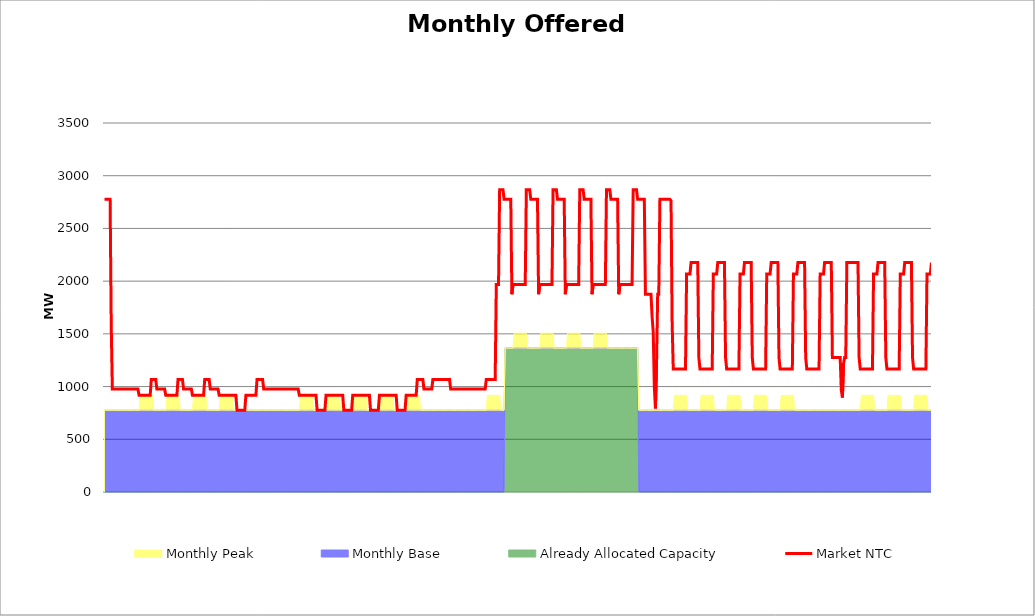
| Category | Market NTC |
|---|---|
| 0 | 2776 |
| 1 | 2776 |
| 2 | 2776 |
| 3 | 2776 |
| 4 | 2776 |
| 5 | 2776 |
| 6 | 1576 |
| 7 | 976 |
| 8 | 976 |
| 9 | 976 |
| 10 | 976 |
| 11 | 976 |
| 12 | 976 |
| 13 | 976 |
| 14 | 976 |
| 15 | 976 |
| 16 | 976 |
| 17 | 976 |
| 18 | 976 |
| 19 | 976 |
| 20 | 976 |
| 21 | 976 |
| 22 | 976 |
| 23 | 976 |
| 24 | 976 |
| 25 | 976 |
| 26 | 976 |
| 27 | 976 |
| 28 | 976 |
| 29 | 976 |
| 30 | 976 |
| 31 | 917 |
| 32 | 917 |
| 33 | 917 |
| 34 | 917 |
| 35 | 917 |
| 36 | 917 |
| 37 | 917 |
| 38 | 917 |
| 39 | 917 |
| 40 | 917 |
| 41 | 917 |
| 42 | 1067 |
| 43 | 1067 |
| 44 | 1067 |
| 45 | 1067 |
| 46 | 1067 |
| 47 | 976 |
| 48 | 976 |
| 49 | 976 |
| 50 | 976 |
| 51 | 976 |
| 52 | 976 |
| 53 | 976 |
| 54 | 976 |
| 55 | 917 |
| 56 | 917 |
| 57 | 917 |
| 58 | 917 |
| 59 | 917 |
| 60 | 917 |
| 61 | 917 |
| 62 | 917 |
| 63 | 917 |
| 64 | 917 |
| 65 | 917 |
| 66 | 1067 |
| 67 | 1067 |
| 68 | 1067 |
| 69 | 1067 |
| 70 | 1067 |
| 71 | 976 |
| 72 | 976 |
| 73 | 976 |
| 74 | 976 |
| 75 | 976 |
| 76 | 976 |
| 77 | 976 |
| 78 | 976 |
| 79 | 917 |
| 80 | 917 |
| 81 | 917 |
| 82 | 917 |
| 83 | 917 |
| 84 | 917 |
| 85 | 917 |
| 86 | 917 |
| 87 | 917 |
| 88 | 917 |
| 89 | 917 |
| 90 | 1067 |
| 91 | 1067 |
| 92 | 1067 |
| 93 | 1067 |
| 94 | 1067 |
| 95 | 976 |
| 96 | 976 |
| 97 | 976 |
| 98 | 976 |
| 99 | 976 |
| 100 | 976 |
| 101 | 976 |
| 102 | 976 |
| 103 | 917 |
| 104 | 917 |
| 105 | 917 |
| 106 | 917 |
| 107 | 917 |
| 108 | 917 |
| 109 | 917 |
| 110 | 917 |
| 111 | 917 |
| 112 | 917 |
| 113 | 917 |
| 114 | 917 |
| 115 | 917 |
| 116 | 917 |
| 117 | 917 |
| 118 | 917 |
| 119 | 776 |
| 120 | 776 |
| 121 | 776 |
| 122 | 776 |
| 123 | 776 |
| 124 | 776 |
| 125 | 776 |
| 126 | 776 |
| 127 | 917 |
| 128 | 917 |
| 129 | 917 |
| 130 | 917 |
| 131 | 917 |
| 132 | 917 |
| 133 | 917 |
| 134 | 917 |
| 135 | 917 |
| 136 | 917 |
| 137 | 1067 |
| 138 | 1067 |
| 139 | 1067 |
| 140 | 1067 |
| 141 | 1067 |
| 142 | 1067 |
| 143 | 976 |
| 144 | 976 |
| 145 | 976 |
| 146 | 976 |
| 147 | 976 |
| 148 | 976 |
| 149 | 976 |
| 150 | 976 |
| 151 | 976 |
| 152 | 976 |
| 153 | 976 |
| 154 | 976 |
| 155 | 976 |
| 156 | 976 |
| 157 | 976 |
| 158 | 976 |
| 159 | 976 |
| 160 | 976 |
| 161 | 976 |
| 162 | 976 |
| 163 | 976 |
| 164 | 976 |
| 165 | 976 |
| 166 | 976 |
| 167 | 976 |
| 168 | 976 |
| 169 | 976 |
| 170 | 976 |
| 171 | 976 |
| 172 | 976 |
| 173 | 976 |
| 174 | 976 |
| 175 | 917 |
| 176 | 917 |
| 177 | 917 |
| 178 | 917 |
| 179 | 917 |
| 180 | 917 |
| 181 | 917 |
| 182 | 917 |
| 183 | 917 |
| 184 | 917 |
| 185 | 917 |
| 186 | 917 |
| 187 | 917 |
| 188 | 917 |
| 189 | 917 |
| 190 | 917 |
| 191 | 776 |
| 192 | 776 |
| 193 | 776 |
| 194 | 776 |
| 195 | 776 |
| 196 | 776 |
| 197 | 776 |
| 198 | 776 |
| 199 | 917 |
| 200 | 917 |
| 201 | 917 |
| 202 | 917 |
| 203 | 917 |
| 204 | 917 |
| 205 | 917 |
| 206 | 917 |
| 207 | 917 |
| 208 | 917 |
| 209 | 917 |
| 210 | 917 |
| 211 | 917 |
| 212 | 917 |
| 213 | 917 |
| 214 | 917 |
| 215 | 776 |
| 216 | 776 |
| 217 | 776 |
| 218 | 776 |
| 219 | 776 |
| 220 | 776 |
| 221 | 776 |
| 222 | 776 |
| 223 | 917 |
| 224 | 917 |
| 225 | 917 |
| 226 | 917 |
| 227 | 917 |
| 228 | 917 |
| 229 | 917 |
| 230 | 917 |
| 231 | 917 |
| 232 | 917 |
| 233 | 917 |
| 234 | 917 |
| 235 | 917 |
| 236 | 917 |
| 237 | 917 |
| 238 | 917 |
| 239 | 776 |
| 240 | 776 |
| 241 | 776 |
| 242 | 776 |
| 243 | 776 |
| 244 | 776 |
| 245 | 776 |
| 246 | 776 |
| 247 | 917 |
| 248 | 917 |
| 249 | 917 |
| 250 | 917 |
| 251 | 917 |
| 252 | 917 |
| 253 | 917 |
| 254 | 917 |
| 255 | 917 |
| 256 | 917 |
| 257 | 917 |
| 258 | 917 |
| 259 | 917 |
| 260 | 917 |
| 261 | 917 |
| 262 | 917 |
| 263 | 776 |
| 264 | 776 |
| 265 | 776 |
| 266 | 776 |
| 267 | 776 |
| 268 | 776 |
| 269 | 776 |
| 270 | 776 |
| 271 | 917 |
| 272 | 917 |
| 273 | 917 |
| 274 | 917 |
| 275 | 917 |
| 276 | 917 |
| 277 | 917 |
| 278 | 917 |
| 279 | 917 |
| 280 | 917 |
| 281 | 1067 |
| 282 | 1067 |
| 283 | 1067 |
| 284 | 1067 |
| 285 | 1067 |
| 286 | 1067 |
| 287 | 976 |
| 288 | 976 |
| 289 | 976 |
| 290 | 976 |
| 291 | 976 |
| 292 | 976 |
| 293 | 976 |
| 294 | 976 |
| 295 | 1067 |
| 296 | 1067 |
| 297 | 1067 |
| 298 | 1067 |
| 299 | 1067 |
| 300 | 1067 |
| 301 | 1067 |
| 302 | 1067 |
| 303 | 1067 |
| 304 | 1067 |
| 305 | 1067 |
| 306 | 1067 |
| 307 | 1067 |
| 308 | 1067 |
| 309 | 1067 |
| 310 | 1067 |
| 311 | 976 |
| 312 | 976 |
| 313 | 976 |
| 314 | 976 |
| 315 | 976 |
| 316 | 976 |
| 317 | 976 |
| 318 | 976 |
| 319 | 976 |
| 320 | 976 |
| 321 | 976 |
| 322 | 976 |
| 323 | 976 |
| 324 | 976 |
| 325 | 976 |
| 326 | 976 |
| 327 | 976 |
| 328 | 976 |
| 329 | 976 |
| 330 | 976 |
| 331 | 976 |
| 332 | 976 |
| 333 | 976 |
| 334 | 976 |
| 335 | 976 |
| 336 | 976 |
| 337 | 976 |
| 338 | 976 |
| 339 | 976 |
| 340 | 976 |
| 341 | 976 |
| 342 | 976 |
| 343 | 1067 |
| 344 | 1067 |
| 345 | 1067 |
| 346 | 1067 |
| 347 | 1067 |
| 348 | 1067 |
| 349 | 1067 |
| 350 | 1067 |
| 351 | 1067 |
| 352 | 1967 |
| 353 | 1967 |
| 354 | 1967 |
| 355 | 2867 |
| 356 | 2867 |
| 357 | 2867 |
| 358 | 2867 |
| 359 | 2776 |
| 360 | 2776 |
| 361 | 2776 |
| 362 | 2776 |
| 363 | 2776 |
| 364 | 2776 |
| 365 | 2776 |
| 366 | 1876 |
| 367 | 1967 |
| 368 | 1967 |
| 369 | 1967 |
| 370 | 1967 |
| 371 | 1967 |
| 372 | 1967 |
| 373 | 1967 |
| 374 | 1967 |
| 375 | 1967 |
| 376 | 1967 |
| 377 | 1967 |
| 378 | 1967 |
| 379 | 2867 |
| 380 | 2867 |
| 381 | 2867 |
| 382 | 2867 |
| 383 | 2776 |
| 384 | 2776 |
| 385 | 2776 |
| 386 | 2776 |
| 387 | 2776 |
| 388 | 2776 |
| 389 | 2776 |
| 390 | 1876 |
| 391 | 1967 |
| 392 | 1967 |
| 393 | 1967 |
| 394 | 1967 |
| 395 | 1967 |
| 396 | 1967 |
| 397 | 1967 |
| 398 | 1967 |
| 399 | 1967 |
| 400 | 1967 |
| 401 | 1967 |
| 402 | 1967 |
| 403 | 2867 |
| 404 | 2867 |
| 405 | 2867 |
| 406 | 2867 |
| 407 | 2776 |
| 408 | 2776 |
| 409 | 2776 |
| 410 | 2776 |
| 411 | 2776 |
| 412 | 2776 |
| 413 | 2776 |
| 414 | 1876 |
| 415 | 1967 |
| 416 | 1967 |
| 417 | 1967 |
| 418 | 1967 |
| 419 | 1967 |
| 420 | 1967 |
| 421 | 1967 |
| 422 | 1967 |
| 423 | 1967 |
| 424 | 1967 |
| 425 | 1967 |
| 426 | 1967 |
| 427 | 2867 |
| 428 | 2867 |
| 429 | 2867 |
| 430 | 2867 |
| 431 | 2776 |
| 432 | 2776 |
| 433 | 2776 |
| 434 | 2776 |
| 435 | 2776 |
| 436 | 2776 |
| 437 | 2776 |
| 438 | 1876 |
| 439 | 1967 |
| 440 | 1967 |
| 441 | 1967 |
| 442 | 1967 |
| 443 | 1967 |
| 444 | 1967 |
| 445 | 1967 |
| 446 | 1967 |
| 447 | 1967 |
| 448 | 1967 |
| 449 | 1967 |
| 450 | 1967 |
| 451 | 2867 |
| 452 | 2867 |
| 453 | 2867 |
| 454 | 2867 |
| 455 | 2776 |
| 456 | 2776 |
| 457 | 2776 |
| 458 | 2776 |
| 459 | 2776 |
| 460 | 2776 |
| 461 | 2776 |
| 462 | 1876 |
| 463 | 1967 |
| 464 | 1967 |
| 465 | 1967 |
| 466 | 1967 |
| 467 | 1967 |
| 468 | 1967 |
| 469 | 1967 |
| 470 | 1967 |
| 471 | 1967 |
| 472 | 1967 |
| 473 | 1967 |
| 474 | 1967 |
| 475 | 2867 |
| 476 | 2867 |
| 477 | 2867 |
| 478 | 2867 |
| 479 | 2776 |
| 480 | 2776 |
| 481 | 2776 |
| 482 | 2776 |
| 483 | 2776 |
| 484 | 2776 |
| 485 | 2776 |
| 486 | 1876 |
| 487 | 1876 |
| 488 | 1876 |
| 489 | 1876 |
| 490 | 1876 |
| 491 | 1876 |
| 492 | 1662 |
| 493 | 1520 |
| 494 | 995 |
| 495 | 793 |
| 496 | 1217 |
| 497 | 1876 |
| 498 | 1876 |
| 499 | 2776 |
| 500 | 2776 |
| 501 | 2776 |
| 502 | 2776 |
| 503 | 2776 |
| 504 | 2776 |
| 505 | 2776 |
| 506 | 2776 |
| 507 | 2776 |
| 508 | 2776 |
| 509 | 2763 |
| 510 | 1608 |
| 511 | 1167 |
| 512 | 1167 |
| 513 | 1167 |
| 514 | 1167 |
| 515 | 1167 |
| 516 | 1167 |
| 517 | 1167 |
| 518 | 1167 |
| 519 | 1167 |
| 520 | 1167 |
| 521 | 1167 |
| 522 | 1167 |
| 523 | 2067 |
| 524 | 2067 |
| 525 | 2067 |
| 526 | 2067 |
| 527 | 2176 |
| 528 | 2176 |
| 529 | 2176 |
| 530 | 2176 |
| 531 | 2176 |
| 532 | 2176 |
| 533 | 2176 |
| 534 | 1276 |
| 535 | 1167 |
| 536 | 1167 |
| 537 | 1167 |
| 538 | 1167 |
| 539 | 1167 |
| 540 | 1167 |
| 541 | 1167 |
| 542 | 1167 |
| 543 | 1167 |
| 544 | 1167 |
| 545 | 1167 |
| 546 | 1167 |
| 547 | 2067 |
| 548 | 2067 |
| 549 | 2067 |
| 550 | 2067 |
| 551 | 2176 |
| 552 | 2176 |
| 553 | 2176 |
| 554 | 2176 |
| 555 | 2176 |
| 556 | 2176 |
| 557 | 2176 |
| 558 | 1276 |
| 559 | 1167 |
| 560 | 1167 |
| 561 | 1167 |
| 562 | 1167 |
| 563 | 1167 |
| 564 | 1167 |
| 565 | 1167 |
| 566 | 1167 |
| 567 | 1167 |
| 568 | 1167 |
| 569 | 1167 |
| 570 | 1167 |
| 571 | 2067 |
| 572 | 2067 |
| 573 | 2067 |
| 574 | 2067 |
| 575 | 2176 |
| 576 | 2176 |
| 577 | 2176 |
| 578 | 2176 |
| 579 | 2176 |
| 580 | 2176 |
| 581 | 2176 |
| 582 | 1276 |
| 583 | 1167 |
| 584 | 1167 |
| 585 | 1167 |
| 586 | 1167 |
| 587 | 1167 |
| 588 | 1167 |
| 589 | 1167 |
| 590 | 1167 |
| 591 | 1167 |
| 592 | 1167 |
| 593 | 1167 |
| 594 | 1167 |
| 595 | 2067 |
| 596 | 2067 |
| 597 | 2067 |
| 598 | 2067 |
| 599 | 2176 |
| 600 | 2176 |
| 601 | 2176 |
| 602 | 2176 |
| 603 | 2176 |
| 604 | 2176 |
| 605 | 2176 |
| 606 | 1276 |
| 607 | 1167 |
| 608 | 1167 |
| 609 | 1167 |
| 610 | 1167 |
| 611 | 1167 |
| 612 | 1167 |
| 613 | 1167 |
| 614 | 1167 |
| 615 | 1167 |
| 616 | 1167 |
| 617 | 1167 |
| 618 | 1167 |
| 619 | 2067 |
| 620 | 2067 |
| 621 | 2067 |
| 622 | 2067 |
| 623 | 2176 |
| 624 | 2176 |
| 625 | 2176 |
| 626 | 2176 |
| 627 | 2176 |
| 628 | 2176 |
| 629 | 2176 |
| 630 | 1276 |
| 631 | 1167 |
| 632 | 1167 |
| 633 | 1167 |
| 634 | 1167 |
| 635 | 1167 |
| 636 | 1167 |
| 637 | 1167 |
| 638 | 1167 |
| 639 | 1167 |
| 640 | 1167 |
| 641 | 1167 |
| 642 | 1167 |
| 643 | 2067 |
| 644 | 2067 |
| 645 | 2067 |
| 646 | 2067 |
| 647 | 2176 |
| 648 | 2176 |
| 649 | 2176 |
| 650 | 2176 |
| 651 | 2176 |
| 652 | 2176 |
| 653 | 2176 |
| 654 | 1276 |
| 655 | 1276 |
| 656 | 1276 |
| 657 | 1276 |
| 658 | 1276 |
| 659 | 1276 |
| 660 | 1276 |
| 661 | 1276 |
| 662 | 967 |
| 663 | 896 |
| 664 | 1217 |
| 665 | 1276 |
| 666 | 1276 |
| 667 | 2176 |
| 668 | 2176 |
| 669 | 2176 |
| 670 | 2176 |
| 671 | 2176 |
| 672 | 2176 |
| 673 | 2176 |
| 674 | 2176 |
| 675 | 2176 |
| 676 | 2176 |
| 677 | 2176 |
| 678 | 1276 |
| 679 | 1167 |
| 680 | 1167 |
| 681 | 1167 |
| 682 | 1167 |
| 683 | 1167 |
| 684 | 1167 |
| 685 | 1167 |
| 686 | 1167 |
| 687 | 1167 |
| 688 | 1167 |
| 689 | 1167 |
| 690 | 1167 |
| 691 | 2067 |
| 692 | 2067 |
| 693 | 2067 |
| 694 | 2067 |
| 695 | 2176 |
| 696 | 2176 |
| 697 | 2176 |
| 698 | 2176 |
| 699 | 2176 |
| 700 | 2176 |
| 701 | 2176 |
| 702 | 1276 |
| 703 | 1167 |
| 704 | 1167 |
| 705 | 1167 |
| 706 | 1167 |
| 707 | 1167 |
| 708 | 1167 |
| 709 | 1167 |
| 710 | 1167 |
| 711 | 1167 |
| 712 | 1167 |
| 713 | 1167 |
| 714 | 1167 |
| 715 | 2067 |
| 716 | 2067 |
| 717 | 2067 |
| 718 | 2067 |
| 719 | 2176 |
| 720 | 2176 |
| 721 | 2176 |
| 722 | 2176 |
| 723 | 2176 |
| 724 | 2176 |
| 725 | 2176 |
| 726 | 1276 |
| 727 | 1167 |
| 728 | 1167 |
| 729 | 1167 |
| 730 | 1167 |
| 731 | 1167 |
| 732 | 1167 |
| 733 | 1167 |
| 734 | 1167 |
| 735 | 1167 |
| 736 | 1167 |
| 737 | 1167 |
| 738 | 1167 |
| 739 | 2067 |
| 740 | 2067 |
| 741 | 2067 |
| 742 | 2067 |
| 743 | 2176 |